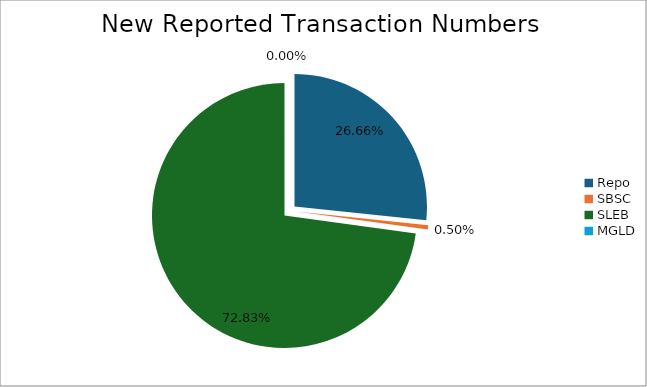
| Category | Series 0 |
|---|---|
| Repo | 274571 |
| SBSC | 5165 |
| SLEB | 750021 |
| MGLD | 36 |